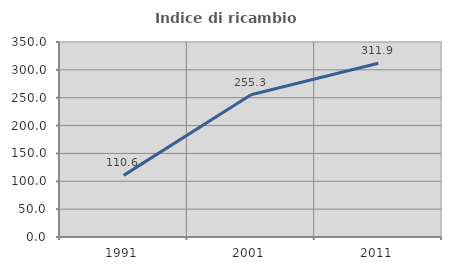
| Category | Indice di ricambio occupazionale  |
|---|---|
| 1991.0 | 110.638 |
| 2001.0 | 255.263 |
| 2011.0 | 311.881 |